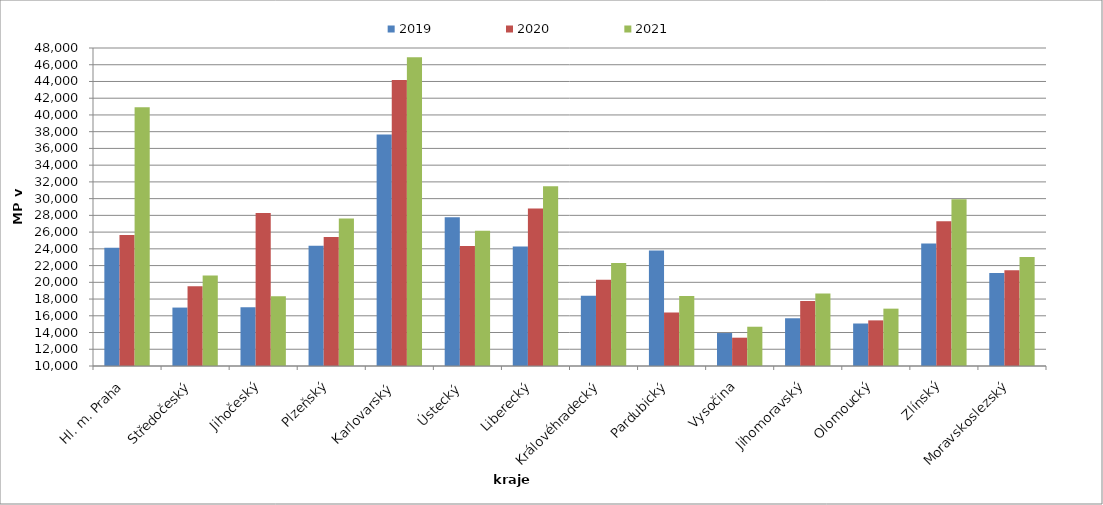
| Category | 2019 | 2020 | 2021 |
|---|---|---|---|
| Hl. m. Praha | 24120.462 | 25668.462 | 40918.588 |
| Středočeský | 16982.35 | 19528.51 | 20805.161 |
| Jihočeský | 17020.964 | 28272.979 | 18321.079 |
| Plzeňský | 24363.392 | 25428.401 | 27623.438 |
| Karlovarský  | 37673.563 | 44180 | 46899.512 |
| Ústecký   | 27763.139 | 24325.499 | 26148.476 |
| Liberecký | 24273.023 | 28834.429 | 31489.035 |
| Královéhradecký | 18391.425 | 20321.35 | 22318.482 |
| Pardubický | 23793.196 | 16393.683 | 18364.215 |
| Vysočina | 13938.351 | 13383.138 | 14692.48 |
| Jihomoravský | 15704.776 | 17781.08 | 18676.436 |
| Olomoucký | 15078.01 | 15451.925 | 16852.669 |
| Zlínský | 24635.271 | 27302.017 | 29911.501 |
| Moravskoslezský | 21123.029 | 21441.978 | 23039.091 |